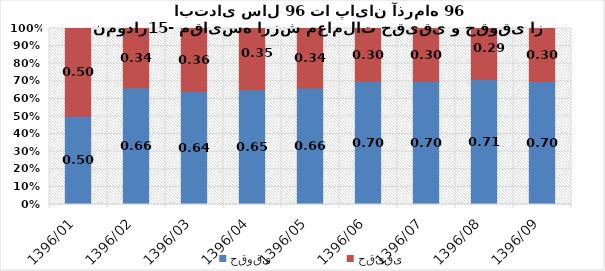
| Category | حقوقی | حقیقی |
|---|---|---|
| 1396/01 | 0.502 | 0.498 |
| 1396/02 | 0.663 | 0.337 |
| 1396/03 | 0.642 | 0.358 |
| 1396/04 | 0.651 | 0.349 |
| 1396/05 | 0.662 | 0.338 |
| 1396/06 | 0.7 | 0.3 |
| 1396/07 | 0.701 | 0.299 |
| 1396/08 | 0.711 | 0.289 |
| 1396/09 | 0.699 | 0.301 |